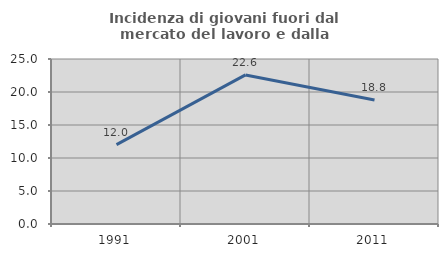
| Category | Incidenza di giovani fuori dal mercato del lavoro e dalla formazione  |
|---|---|
| 1991.0 | 12.017 |
| 2001.0 | 22.589 |
| 2011.0 | 18.78 |